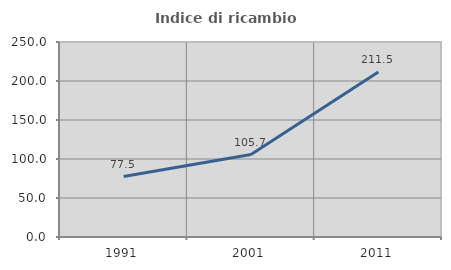
| Category | Indice di ricambio occupazionale  |
|---|---|
| 1991.0 | 77.545 |
| 2001.0 | 105.735 |
| 2011.0 | 211.5 |